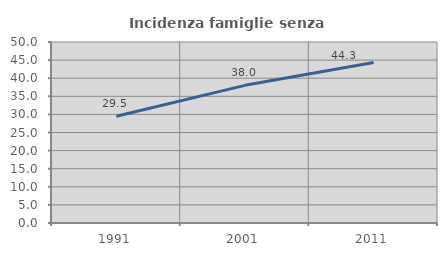
| Category | Incidenza famiglie senza nuclei |
|---|---|
| 1991.0 | 29.508 |
| 2001.0 | 38.028 |
| 2011.0 | 44.348 |